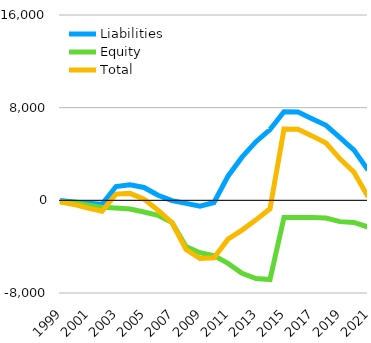
| Category | Liabilities  | Equity  | Total |
|---|---|---|---|
| 1999 | -5.432 | -127.839 | -133.271 |
| 2000 | -137.63 | -217.914 | -355.544 |
| 2001 | -256.037 | -409.491 | -665.528 |
| 2002 | -347.514 | -588.568 | -936.082 |
| 2003 | 1190.888 | -654.225 | 536.663 |
| 2004 | 1348.224 | -748.45 | 599.774 |
| 2005 | 1108.662 | -1006.634 | 102.028 |
| 2006 | 440.799 | -1292.92 | -852.121 |
| 2007 | -21.023 | -1914.03 | -1935.053 |
| 2008 | -264.81 | -3980.449 | -4245.259 |
| 2009 | -497.491 | -4527.704 | -5025.195 |
| 2010 | -188.72 | -4769.426 | -4958.146 |
| 2011 | 2087.106 | -5442.785 | -3355.679 |
| 2012 | 3726.176 | -6298.335 | -2572.159 |
| 2013 | 5062.399 | -6747.302 | -1684.903 |
| 2014 | 6110.718 | -6839.539 | -728.821 |
| 2015 | 7643.848 | -1485.293 | 6158.555 |
| 2016 | 7617.008 | -1485.293 | 6131.715 |
| 2017 | 7048.65 | -1485.293 | 5563.357 |
| 2018 | 6476.667 | -1533.07 | 4943.597 |
| 2019 | 5419.556 | -1839.118 | 3580.438 |
| 2020 | 4332.432 | -1906.965 | 2425.467 |
| 2021 | 2609.732 | -2309.265 | 300.467 |